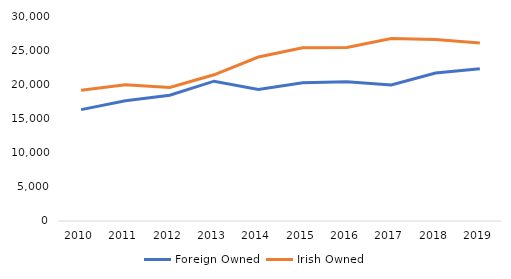
| Category | Foreign Owned | Irish Owned |
|---|---|---|
| 2010.0 | 16300 | 19148 |
| 2011.0 | 17602 | 19945 |
| 2012.0 | 18414 | 19548 |
| 2013.0 | 20462 | 21399 |
| 2014.0 | 19230 | 24000 |
| 2015.0 | 20241 | 25367 |
| 2016.0 | 20393 | 25392 |
| 2017.0 | 19892 | 26717 |
| 2018.0 | 21655 | 26571 |
| 2019.0 | 22291 | 26063 |